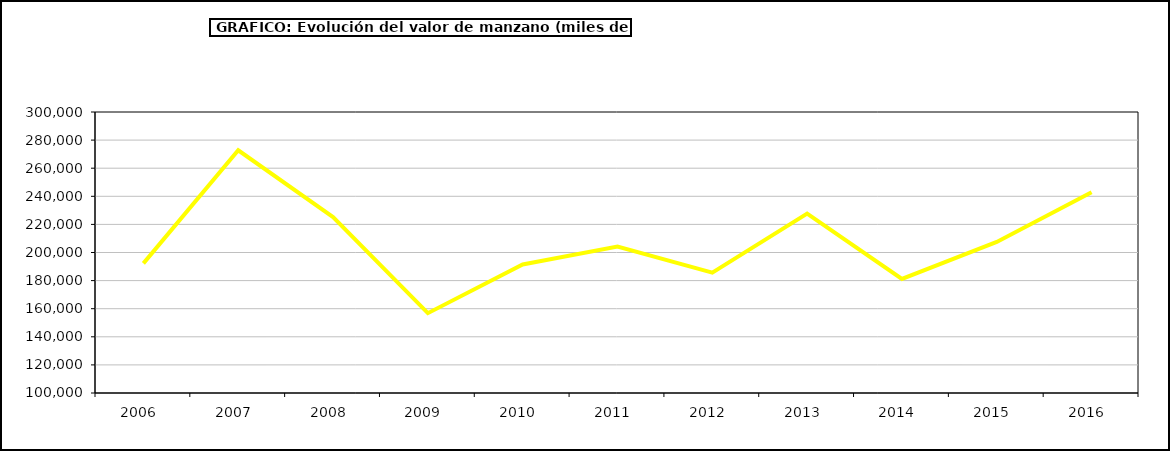
| Category | valor manzano |
|---|---|
| 2006.0 | 192253.51 |
| 2007.0 | 272749.52 |
| 2008.0 | 225184.677 |
| 2009.0 | 156815.53 |
| 2010.0 | 191488.023 |
| 2011.0 | 204168.506 |
| 2012.0 | 185703.956 |
| 2013.0 | 227733.263 |
| 2014.0 | 181209.741 |
| 2015.0 | 207515 |
| 2016.0 | 242923 |